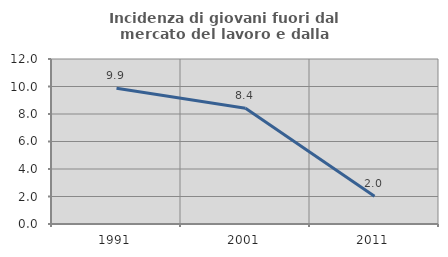
| Category | Incidenza di giovani fuori dal mercato del lavoro e dalla formazione  |
|---|---|
| 1991.0 | 9.877 |
| 2001.0 | 8.411 |
| 2011.0 | 2.02 |